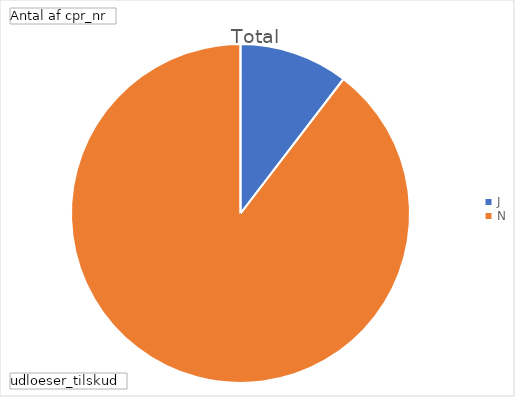
| Category | Total |
|---|---|
| J | 13 |
| N | 112 |